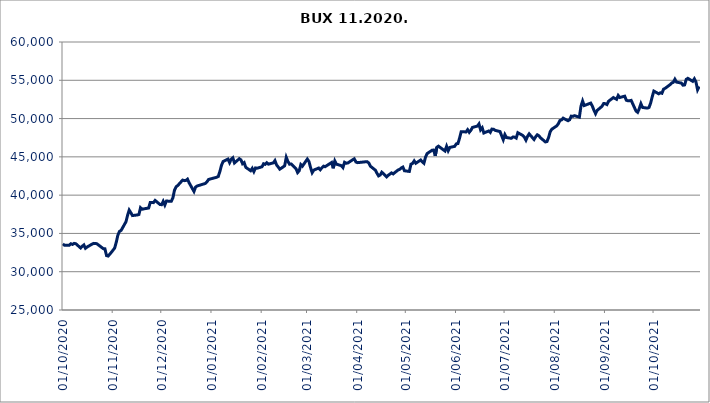
| Category | BUX |
|---|---|
| 01/10/2020 | 33657.71 |
| 02/10/2020 | 33449.84 |
| 05/10/2020 | 33468.11 |
| 06/10/2020 | 33651.55 |
| 07/10/2020 | 33561.05 |
| 08/10/2020 | 33697.94 |
| 09/10/2020 | 33660.44 |
| 12/10/2020 | 33097.01 |
| 13/10/2020 | 33322.71 |
| 14/10/2020 | 33496.67 |
| 15/10/2020 | 33061.27 |
| 16/10/2020 | 33225.15 |
| 19/10/2020 | 33596.79 |
| 20/10/2020 | 33700.78 |
| 21/10/2020 | 33696.73 |
| 22/10/2020 | 33655.1 |
| 26/10/2020 | 33012.62 |
| 27/10/2020 | 32992.69 |
| 28/10/2020 | 32106.78 |
| 29/10/2020 | 32047.68 |
| 30/10/2020 | 32279.17 |
| 02/11/2020 | 33077.55 |
| 03/11/2020 | 33834.43 |
| 04/11/2020 | 34774.72 |
| 05/11/2020 | 35264.98 |
| 06/11/2020 | 35390.44 |
| 09/11/2020 | 36524.01 |
| 10/11/2020 | 37366.63 |
| 11/11/2020 | 38045.8 |
| 12/11/2020 | 37712.82 |
| 13/11/2020 | 37335.1 |
| 16/11/2020 | 37414.6 |
| 17/11/2020 | 37470.5 |
| 18/11/2020 | 38361.82 |
| 19/11/2020 | 38163.61 |
| 20/11/2020 | 38204.67 |
| 23/11/2020 | 38319.06 |
| 24/11/2020 | 39046.5 |
| 25/11/2020 | 39035.1 |
| 26/11/2020 | 39023.56 |
| 27/11/2020 | 39308.9 |
| 30/11/2020 | 38782.16 |
| 01/12/2020 | 38751.98 |
| 02/12/2020 | 39191.11 |
| 03/12/2020 | 38705.12 |
| 04/12/2020 | 39227.87 |
| 07/12/2020 | 39198.31 |
| 08/12/2020 | 39655.97 |
| 09/12/2020 | 40675.89 |
| 10/12/2020 | 41103.01 |
| 11/12/2020 | 41263.67 |
| 14/12/2020 | 41967.89 |
| 15/12/2020 | 41894.09 |
| 16/12/2020 | 41911.27 |
| 17/12/2020 | 42088.03 |
| 18/12/2020 | 41614.92 |
| 21/12/2020 | 40483.17 |
| 22/12/2020 | 41049.52 |
| 23/12/2020 | 41197.14 |
| 28/12/2020 | 41528.44 |
| 29/12/2020 | 41733.11 |
| 30/12/2020 | 42047.586 |
| 04/01/2021 | 42333.48 |
| 05/01/2021 | 42434.3 |
| 06/01/2021 | 43085.06 |
| 07/01/2021 | 43900.7 |
| 08/01/2021 | 44393.21 |
| 11/01/2021 | 44715.79 |
| 12/01/2021 | 44246.56 |
| 13/01/2021 | 44684.36 |
| 14/01/2021 | 44876.42 |
| 15/01/2021 | 44204.45 |
| 18/01/2021 | 44755.59 |
| 19/01/2021 | 44610 |
| 20/01/2021 | 44103.4 |
| 21/01/2021 | 44250.43 |
| 22/01/2021 | 43630.22 |
| 25/01/2021 | 43188.94 |
| 26/01/2021 | 43507.13 |
| 27/01/2021 | 43077.24 |
| 28/01/2021 | 43552.04 |
| 29/01/2021 | 43517.12 |
| 01/02/2021 | 43703.87 |
| 02/02/2021 | 44101.05 |
| 03/02/2021 | 44016.29 |
| 04/02/2021 | 44226.34 |
| 05/02/2021 | 44045.26 |
| 08/02/2021 | 44215.97 |
| 09/02/2021 | 44511.16 |
| 10/02/2021 | 43950.78 |
| 11/02/2021 | 43676.69 |
| 12/02/2021 | 43389.33 |
| 15/02/2021 | 43823.57 |
| 16/02/2021 | 44941.65 |
| 17/02/2021 | 44416.15 |
| 18/02/2021 | 44046.56 |
| 19/02/2021 | 44069.31 |
| 22/02/2021 | 43457.15 |
| 23/02/2021 | 42945.11 |
| 24/02/2021 | 43183.45 |
| 25/02/2021 | 43999.47 |
| 26/02/2021 | 43790.17 |
| 01/03/2021 | 44710.25 |
| 02/03/2021 | 44402.33 |
| 03/03/2021 | 43595.22 |
| 04/03/2021 | 42932.61 |
| 05/03/2021 | 43269 |
| 08/03/2021 | 43540.36 |
| 09/03/2021 | 43312.66 |
| 10/03/2021 | 43579.39 |
| 11/03/2021 | 43784.89 |
| 12/03/2021 | 43711.84 |
| 16/03/2021 | 44268.77 |
| 17/03/2021 | 43504.47 |
| 18/03/2021 | 44465.75 |
| 19/03/2021 | 44042.12 |
| 22/03/2021 | 43851.96 |
| 23/03/2021 | 43603.02 |
| 24/03/2021 | 44290.24 |
| 25/03/2021 | 44168.81 |
| 26/03/2021 | 44201.25 |
| 29/03/2021 | 44617.73 |
| 30/03/2021 | 44746.76 |
| 31/03/2021 | 44326.18 |
| 01/04/2021 | 44242.93 |
| 06/04/2021 | 44357.86 |
| 07/04/2021 | 44357.64 |
| 08/04/2021 | 44194.16 |
| 09/04/2021 | 43775.41 |
| 12/04/2021 | 43267.25 |
| 13/04/2021 | 42865.63 |
| 14/04/2021 | 42514.94 |
| 15/04/2021 | 42626.71 |
| 16/04/2021 | 42997.61 |
| 19/04/2021 | 42388.09 |
| 20/04/2021 | 42597.26 |
| 21/04/2021 | 42753.6 |
| 22/04/2021 | 42906.48 |
| 23/04/2021 | 42772.95 |
| 26/04/2021 | 43281.61 |
| 27/04/2021 | 43357.19 |
| 28/04/2021 | 43549.43 |
| 29/04/2021 | 43665.42 |
| 30/04/2021 | 43183.2 |
| 03/05/2021 | 43093.89 |
| 04/05/2021 | 44036.18 |
| 05/05/2021 | 44142.7 |
| 06/05/2021 | 44472.71 |
| 07/05/2021 | 44164.37 |
| 10/05/2021 | 44587.59 |
| 11/05/2021 | 44350.67 |
| 12/05/2021 | 44160.71 |
| 13/05/2021 | 44974.08 |
| 14/05/2021 | 45429.12 |
| 17/05/2021 | 45862.01 |
| 18/05/2021 | 45891.45 |
| 19/05/2021 | 45128.56 |
| 20/05/2021 | 46261.37 |
| 21/05/2021 | 46396.87 |
| 25/05/2021 | 45765.15 |
| 26/05/2021 | 46379.32 |
| 27/05/2021 | 45802.61 |
| 28/05/2021 | 46233.29 |
| 31/05/2021 | 46371.02 |
| 01/06/2021 | 46699.74 |
| 02/06/2021 | 46736.89 |
| 03/06/2021 | 47422.77 |
| 04/06/2021 | 48282.14 |
| 07/06/2021 | 48255.9 |
| 08/06/2021 | 48546.45 |
| 09/06/2021 | 48206.56 |
| 10/06/2021 | 48475.07 |
| 11/06/2021 | 48845.84 |
| 14/06/2021 | 49015.24 |
| 15/06/2021 | 49299.48 |
| 16/06/2021 | 48525.74 |
| 17/06/2021 | 48795.68 |
| 18/06/2021 | 48117.72 |
| 21/06/2021 | 48379.62 |
| 22/06/2021 | 48193.16 |
| 23/06/2021 | 48624.32 |
| 24/06/2021 | 48610.4 |
| 25/06/2021 | 48461.47 |
| 28/06/2021 | 48301.62 |
| 29/06/2021 | 47759.62 |
| 30/06/2021 | 47238.09 |
| 01/07/2021 | 47908.81 |
| 02/07/2021 | 47520.42 |
| 05/07/2021 | 47423.61 |
| 06/07/2021 | 47592.47 |
| 07/07/2021 | 47574.37 |
| 08/07/2021 | 47452.73 |
| 09/07/2021 | 48157.57 |
| 12/07/2021 | 47804.26 |
| 13/07/2021 | 47592.34 |
| 14/07/2021 | 47184.6 |
| 15/07/2021 | 47677.82 |
| 16/07/2021 | 48003.25 |
| 19/07/2021 | 47268.49 |
| 20/07/2021 | 47622.68 |
| 21/07/2021 | 47882.56 |
| 22/07/2021 | 47756.88 |
| 23/07/2021 | 47491.69 |
| 26/07/2021 | 46952.76 |
| 27/07/2021 | 47002.77 |
| 28/07/2021 | 47527.53 |
| 29/07/2021 | 48286.06 |
| 30/07/2021 | 48610.95 |
| 02/08/2021 | 49041.18 |
| 03/08/2021 | 49315.61 |
| 04/08/2021 | 49745.57 |
| 05/08/2021 | 49830.28 |
| 06/08/2021 | 50050.88 |
| 09/08/2021 | 49721.84 |
| 10/08/2021 | 49849.71 |
| 11/08/2021 | 50317.1 |
| 12/08/2021 | 50289.64 |
| 13/08/2021 | 50378.65 |
| 16/08/2021 | 50183.56 |
| 17/08/2021 | 51626.62 |
| 18/08/2021 | 52288.87 |
| 19/08/2021 | 51696.55 |
| 23/08/2021 | 52023.19 |
| 24/08/2021 | 51633.85 |
| 25/08/2021 | 51093.8 |
| 26/08/2021 | 50640.51 |
| 27/08/2021 | 51068.8 |
| 30/08/2021 | 51602.58 |
| 31/08/2021 | 51969.67 |
| 01/09/2021 | 51946.96 |
| 02/09/2021 | 51830.24 |
| 03/09/2021 | 52255.11 |
| 06/09/2021 | 52743.09 |
| 07/09/2021 | 52623.96 |
| 08/09/2021 | 52514.94 |
| 09/09/2021 | 53015.67 |
| 10/09/2021 | 52755.68 |
| 13/09/2021 | 52922.72 |
| 14/09/2021 | 52392.39 |
| 15/09/2021 | 52317.91 |
| 16/09/2021 | 52331.31 |
| 17/09/2021 | 52376.91 |
| 20/09/2021 | 50982.15 |
| 21/09/2021 | 50815.56 |
| 22/09/2021 | 51298.14 |
| 23/09/2021 | 51946.86 |
| 24/09/2021 | 51453.71 |
| 27/09/2021 | 51365.99 |
| 28/09/2021 | 51446.2 |
| 29/09/2021 | 52004.6 |
| 30/09/2021 | 52854.65 |
| 01/10/2021 | 53589.8 |
| 04/10/2021 | 53234.94 |
| 05/10/2021 | 53369.78 |
| 06/10/2021 | 53305.16 |
| 07/10/2021 | 53844.59 |
| 08/10/2021 | 53955.85 |
| 11/10/2021 | 54432.56 |
| 12/10/2021 | 54648.43 |
| 13/10/2021 | 54733.73 |
| 14/10/2021 | 55136 |
| 15/10/2021 | 54764.34 |
| 18/10/2021 | 54637.92 |
| 19/10/2021 | 54356.89 |
| 20/10/2021 | 54393.63 |
| 21/10/2021 | 55121.35 |
| 22/10/2021 | 55254.39 |
| 25/10/2021 | 54867.62 |
| 26/10/2021 | 55191.91 |
| 27/10/2021 | 54780.65 |
| 28/10/2021 | 53766.44 |
| 29/10/2021 | 54197.71 |